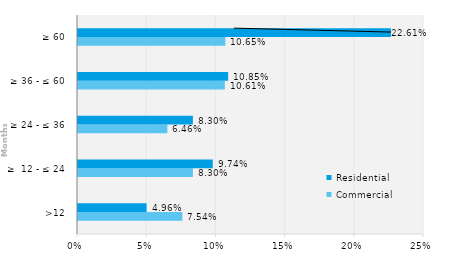
| Category | Commercial | Residential |
|---|---|---|
| >12 | 0.075 | 0.05 |
| ≥  12 - ≤ 24 | 0.083 | 0.097 |
| ≥ 24 - ≤ 36 | 0.065 | 0.083 |
| ≥ 36 - ≤ 60 | 0.106 | 0.108 |
| ≥ 60 | 0.106 | 0.226 |